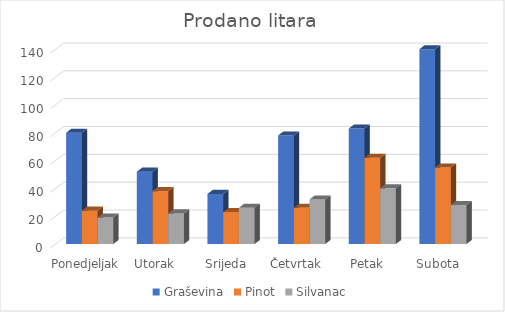
| Category | Graševina | Pinot | Silvanac |
|---|---|---|---|
| Ponedjeljak | 80 | 24 | 19 |
| Utorak | 52 | 38 | 22 |
| Srijeda | 36 | 23 | 26 |
| Četvrtak | 78 | 26 | 32 |
| Petak | 83 | 62 | 40 |
| Subota | 140 | 55 | 28 |